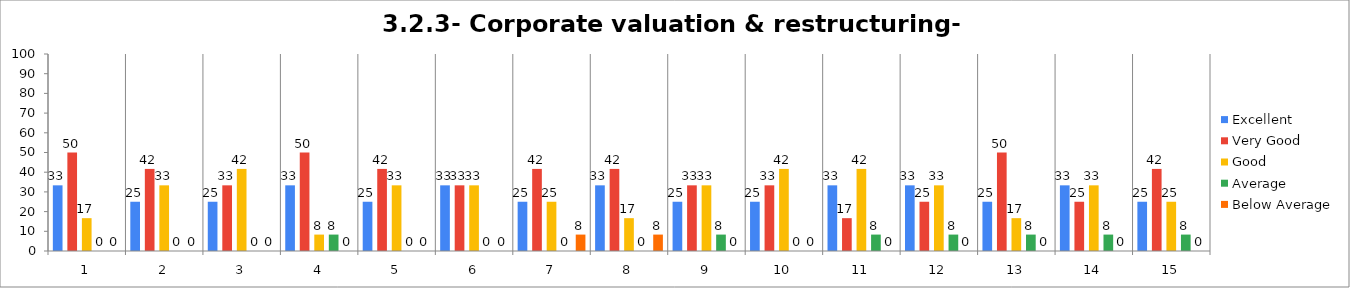
| Category | Excellent | Very Good | Good | Average | Below Average |
|---|---|---|---|---|---|
| 0 | 33.333 | 50 | 16.667 | 0 | 0 |
| 1 | 25 | 41.667 | 33.333 | 0 | 0 |
| 2 | 25 | 33.333 | 41.667 | 0 | 0 |
| 3 | 33.333 | 50 | 8.333 | 8.333 | 0 |
| 4 | 25 | 41.667 | 33.333 | 0 | 0 |
| 5 | 33.333 | 33.333 | 33.333 | 0 | 0 |
| 6 | 25 | 41.667 | 25 | 0 | 8.333 |
| 7 | 33.333 | 41.667 | 16.667 | 0 | 8.333 |
| 8 | 25 | 33.333 | 33.333 | 8.333 | 0 |
| 9 | 25 | 33.333 | 41.667 | 0 | 0 |
| 10 | 33.333 | 16.667 | 41.667 | 8.333 | 0 |
| 11 | 33.333 | 25 | 33.333 | 8.333 | 0 |
| 12 | 25 | 50 | 16.667 | 8.333 | 0 |
| 13 | 33.333 | 25 | 33.333 | 8.333 | 0 |
| 14 | 25 | 41.667 | 25 | 8.333 | 0 |